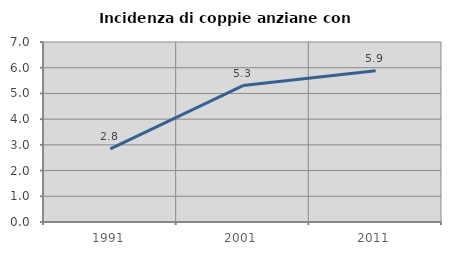
| Category | Incidenza di coppie anziane con figli |
|---|---|
| 1991.0 | 2.846 |
| 2001.0 | 5.306 |
| 2011.0 | 5.882 |